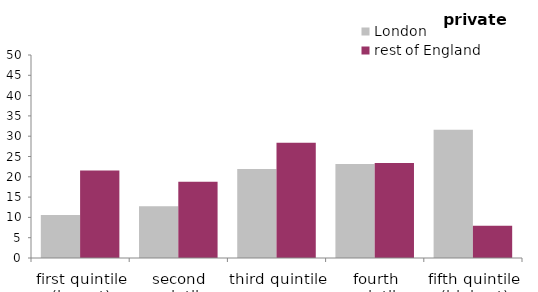
| Category | London | rest of England |
|---|---|---|
| first quintile (lowest) | 10.581 | 21.55 |
| second quintile | 12.754 | 18.773 |
| third quintile | 21.933 | 28.357 |
| fourth quintile | 23.151 | 23.392 |
| fifth quintile (highest) | 31.581 | 7.929 |